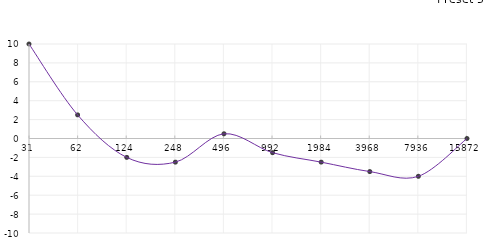
| Category | Series 0 |
|---|---|
| 31.0 | 10 |
| 62.0 | 2.5 |
| 125.0 | -2 |
| 250.0 | -2.5 |
| 500.0 | 0.5 |
| 1000.0 | -1.5 |
| 2000.0 | -2.5 |
| 4000.0 | -3.5 |
| 8000.0 | -4 |
| 16000.0 | 0 |